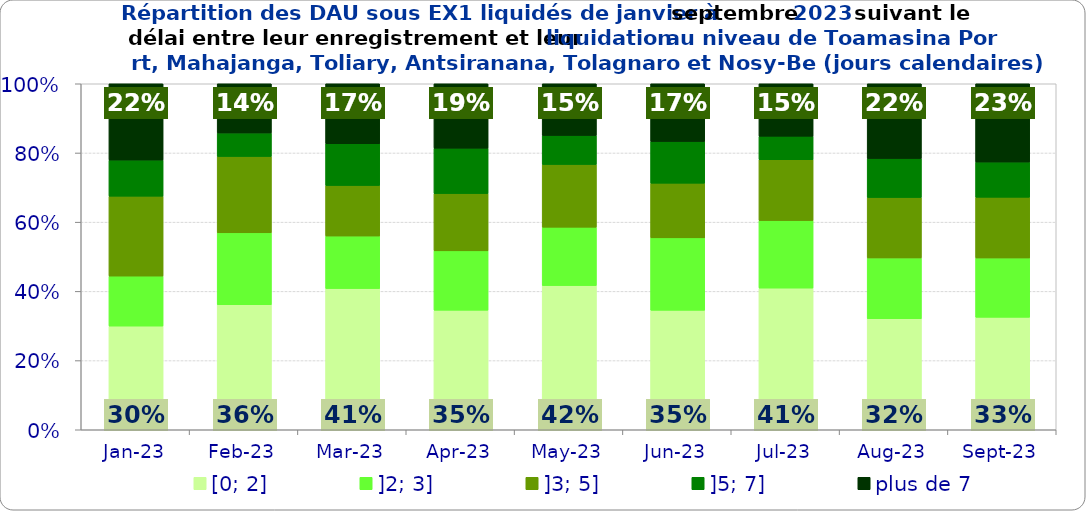
| Category | [0; 2] | ]2; 3] | ]3; 5] | ]5; 7] | plus de 7 |
|---|---|---|---|---|---|
| 2023-01-01 | 0.3 | 0.145 | 0.231 | 0.104 | 0.221 |
| 2023-02-01 | 0.362 | 0.208 | 0.221 | 0.068 | 0.142 |
| 2023-03-01 | 0.408 | 0.152 | 0.146 | 0.121 | 0.173 |
| 2023-04-01 | 0.345 | 0.172 | 0.165 | 0.131 | 0.186 |
| 2023-05-01 | 0.417 | 0.169 | 0.181 | 0.084 | 0.149 |
| 2023-06-01 | 0.345 | 0.209 | 0.158 | 0.12 | 0.167 |
| 2023-07-01 | 0.409 | 0.195 | 0.176 | 0.068 | 0.152 |
| 2023-08-01 | 0.321 | 0.176 | 0.175 | 0.113 | 0.216 |
| 2023-09-01 | 0.325 | 0.171 | 0.175 | 0.102 | 0.226 |